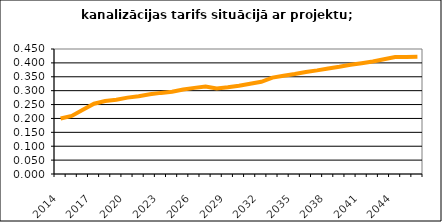
| Category | Series 0 |
|---|---|
| 2014.0 | 0.2 |
| 2015.0 | 0.209 |
| 2016.0 | 0.231 |
| 2017.0 | 0.253 |
| 2018.0 | 0.263 |
| 2019.0 | 0.267 |
| 2020.0 | 0.275 |
| 2021.0 | 0.28 |
| 2022.0 | 0.287 |
| 2023.0 | 0.292 |
| 2024.0 | 0.296 |
| 2025.0 | 0.304 |
| 2026.0 | 0.31 |
| 2027.0 | 0.315 |
| 2028.0 | 0.308 |
| 2029.0 | 0.312 |
| 2030.0 | 0.318 |
| 2031.0 | 0.325 |
| 2032.0 | 0.332 |
| 2033.0 | 0.347 |
| 2034.0 | 0.354 |
| 2035.0 | 0.36 |
| 2036.0 | 0.367 |
| 2037.0 | 0.373 |
| 2038.0 | 0.38 |
| 2039.0 | 0.386 |
| 2040.0 | 0.393 |
| 2041.0 | 0.399 |
| 2042.0 | 0.405 |
| 2043.0 | 0.413 |
| 2044.0 | 0.421 |
| 2045.0 | 0.421 |
| 2046.0 | 0.422 |